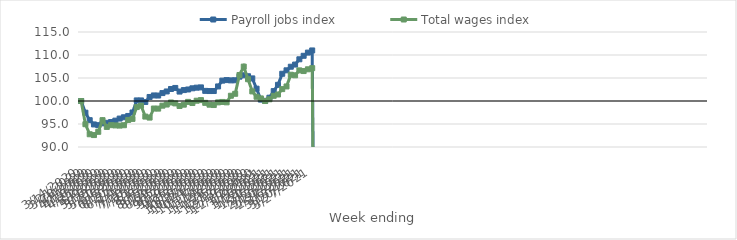
| Category | Payroll jobs index | Total wages index |
|---|---|---|
| 14/03/2020 | 100 | 100 |
| 21/03/2020 | 97.462 | 94.955 |
| 28/03/2020 | 95.834 | 92.772 |
| 04/04/2020 | 94.905 | 92.593 |
| 11/04/2020 | 94.748 | 93.303 |
| 18/04/2020 | 95.145 | 95.834 |
| 25/04/2020 | 95.255 | 94.364 |
| 02/05/2020 | 95.427 | 94.746 |
| 09/05/2020 | 95.733 | 94.692 |
| 16/05/2020 | 96.18 | 94.657 |
| 23/05/2020 | 96.462 | 94.732 |
| 30/05/2020 | 96.747 | 95.882 |
| 06/06/2020 | 97.501 | 96.109 |
| 13/06/2020 | 100.127 | 98.682 |
| 20/06/2020 | 100.123 | 99.001 |
| 27/06/2020 | 99.791 | 96.612 |
| 04/07/2020 | 100.874 | 96.394 |
| 11/07/2020 | 101.208 | 98.363 |
| 18/07/2020 | 101.187 | 98.344 |
| 25/07/2020 | 101.721 | 98.987 |
| 01/08/2020 | 102.072 | 99.232 |
| 08/08/2020 | 102.61 | 99.675 |
| 15/08/2020 | 102.839 | 99.479 |
| 22/08/2020 | 102.049 | 98.917 |
| 29/08/2020 | 102.372 | 99.203 |
| 05/09/2020 | 102.505 | 99.808 |
| 12/09/2020 | 102.76 | 99.56 |
| 19/09/2020 | 102.899 | 100.064 |
| 26/09/2020 | 102.958 | 100.193 |
| 03/10/2020 | 102.204 | 99.598 |
| 10/10/2020 | 102.165 | 99.198 |
| 17/10/2020 | 102.168 | 99.121 |
| 24/10/2020 | 103.168 | 99.699 |
| 31/10/2020 | 104.428 | 99.793 |
| 07/11/2020 | 104.545 | 99.709 |
| 14/11/2020 | 104.482 | 101.142 |
| 21/11/2020 | 104.507 | 101.567 |
| 28/11/2020 | 105.29 | 105.655 |
| 05/12/2020 | 105.591 | 107.478 |
| 12/12/2020 | 105.384 | 104.734 |
| 19/12/2020 | 104.913 | 102.088 |
| 26/12/2020 | 102.681 | 100.921 |
| 02/01/2021 | 100.303 | 100.563 |
| 09/01/2021 | 100.046 | 99.994 |
| 16/01/2021 | 100.715 | 100.371 |
| 23/01/2021 | 102.151 | 101.127 |
| 30/01/2021 | 103.514 | 101.415 |
| 06/02/2021 | 105.922 | 102.583 |
| 13/02/2021 | 106.67 | 103.161 |
| 20/02/2021 | 107.452 | 105.711 |
| 27/02/2021 | 107.92 | 105.585 |
| 06/03/2021 | 109.066 | 106.657 |
| 13/03/2021 | 109.83 | 106.51 |
| 20/03/2021 | 110.523 | 106.89 |
| 27/03/2021 | 110.989 | 107.138 |